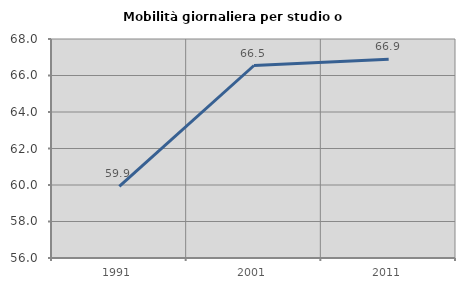
| Category | Mobilità giornaliera per studio o lavoro |
|---|---|
| 1991.0 | 59.93 |
| 2001.0 | 66.548 |
| 2011.0 | 66.893 |